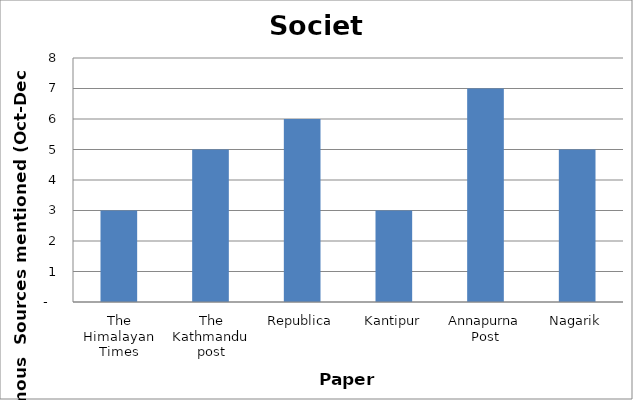
| Category | Society |
|---|---|
| The Himalayan Times | 3 |
| The Kathmandu post | 5 |
| Republica | 6 |
| Kantipur | 3 |
| Annapurna Post | 7 |
| Nagarik | 5 |